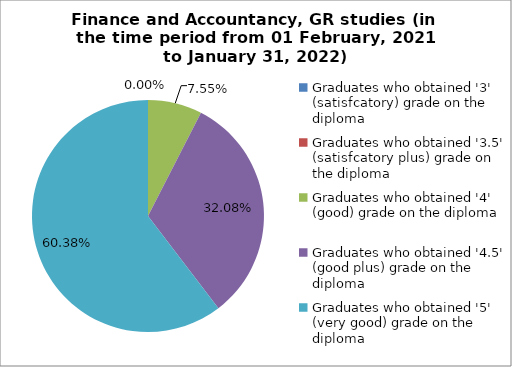
| Category | Series 0 |
|---|---|
| Graduates who obtained '3' (satisfcatory) grade on the diploma  | 0 |
| Graduates who obtained '3.5' (satisfcatory plus) grade on the diploma  | 0 |
| Graduates who obtained '4' (good) grade on the diploma  | 7.547 |
| Graduates who obtained '4.5' (good plus) grade on the diploma  | 32.075 |
| Graduates who obtained '5' (very good) grade on the diploma  | 60.377 |